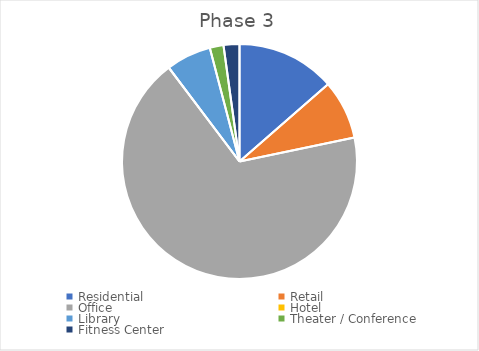
| Category | Series 0 |
|---|---|
| Residential | 0.155 |
| Retail | 0.093 |
| Office | 0.778 |
| Hotel | 0 |
| Library | 0.071 |
| Theater / Conference | 0.022 |
| Fitness Center | 0.025 |